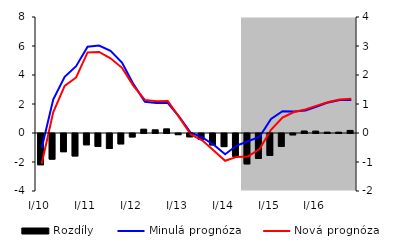
| Category | Rozdíly |
|---|---|
| 0 | -1.077 |
| 1 | -0.884 |
| 2 | -0.628 |
| 3 | -0.773 |
| 4 | -0.389 |
| 5 | -0.442 |
| 6 | -0.515 |
| 7 | -0.357 |
| 8 | -0.119 |
| 9 | 0.132 |
| 10 | 0.111 |
| 11 | 0.144 |
| 12 | -0.04 |
| 13 | -0.113 |
| 14 | -0.199 |
| 15 | -0.394 |
| 16 | -0.452 |
| 17 | -0.783 |
| 18 | -1.046 |
| 19 | -0.857 |
| 20 | -0.755 |
| 21 | -0.442 |
| 22 | -0.046 |
| 23 | 0.07 |
| 24 | 0.066 |
| 25 | 0.031 |
| 26 | 0.029 |
| 27 | 0.089 |